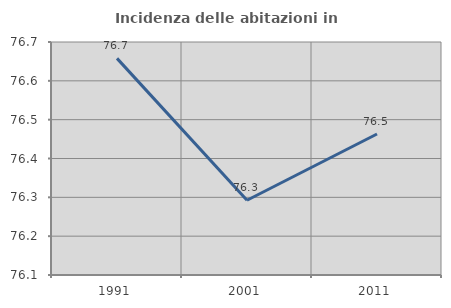
| Category | Incidenza delle abitazioni in proprietà  |
|---|---|
| 1991.0 | 76.658 |
| 2001.0 | 76.293 |
| 2011.0 | 76.463 |